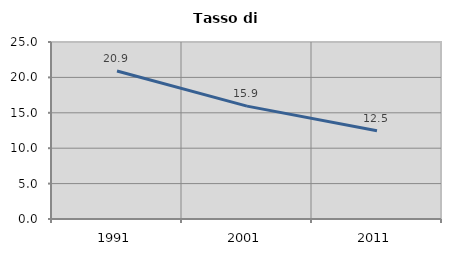
| Category | Tasso di disoccupazione   |
|---|---|
| 1991.0 | 20.905 |
| 2001.0 | 15.944 |
| 2011.0 | 12.476 |